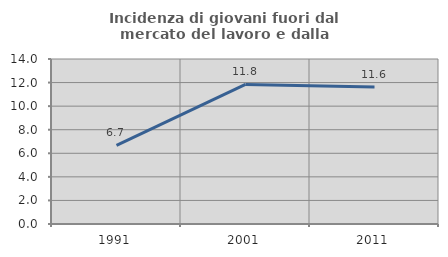
| Category | Incidenza di giovani fuori dal mercato del lavoro e dalla formazione  |
|---|---|
| 1991.0 | 6.667 |
| 2001.0 | 11.842 |
| 2011.0 | 11.628 |